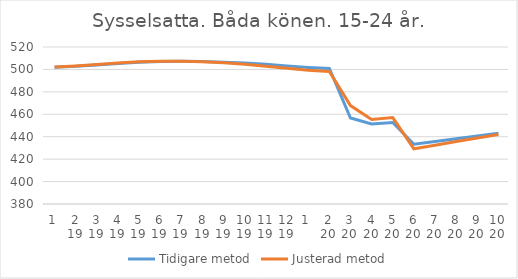
| Category | Tidigare metod | Justerad metod |
|---|---|---|
| 0 | 501.92 | 502.07 |
| 1 | 502.77 | 503.07 |
| 2 | 504.04 | 504.43 |
| 3 | 505.38 | 505.81 |
| 4 | 506.42 | 506.83 |
| 5 | 507.02 | 507.37 |
| 6 | 507.2 | 507.38 |
| 7 | 507 | 506.86 |
| 8 | 506.49 | 505.92 |
| 9 | 505.65 | 504.54 |
| 10 | 504.53 | 502.85 |
| 11 | 503.17 | 501 |
| 12 | 501.79 | 499.26 |
| 13 | 500.81 | 498.1 |
| 14 | 456.65 | 467.76 |
| 15 | 451.37 | 455.31 |
| 16 | 452.66 | 457.06 |
| 17 | 433.3 | 429.27 |
| 18 | 435.66 | 432.36 |
| 19 | 438.21 | 435.66 |
| 20 | 440.75 | 438.92 |
| 21 | 443.17 | 441.91 |